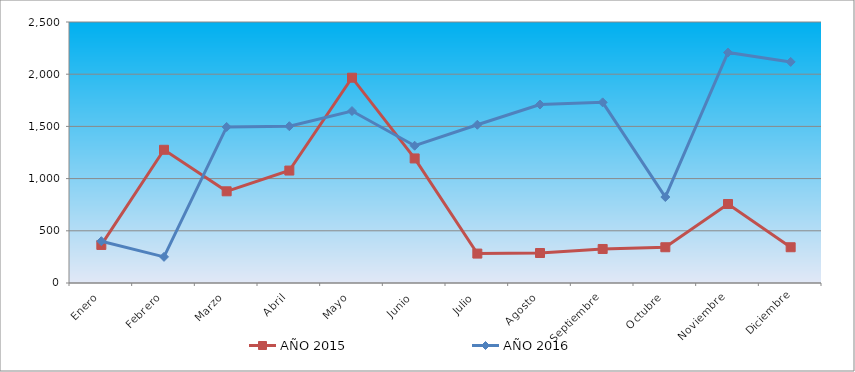
| Category | AÑO 2015 | AÑO 2016 |
|---|---|---|
| Enero | 364.565 | 400.617 |
| Febrero | 1275.977 | 250.385 |
| Marzo | 878.27 | 1494.832 |
| Abril | 1077.123 | 1501.752 |
| Mayo | 1966.44 | 1647.083 |
| Junio | 1193.121 | 1314.898 |
| Julio | 281.709 | 1515.593 |
| Agosto | 287.233 | 1709.368 |
| Septiembre | 325.899 | 1730.129 |
| Octubre | 342.47 | 823.541 |
| Noviembre | 756.748 | 2207.645 |
| Diciembre | 342.47 | 2117.678 |